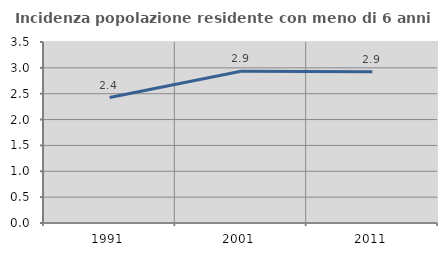
| Category | Incidenza popolazione residente con meno di 6 anni |
|---|---|
| 1991.0 | 2.427 |
| 2001.0 | 2.934 |
| 2011.0 | 2.925 |